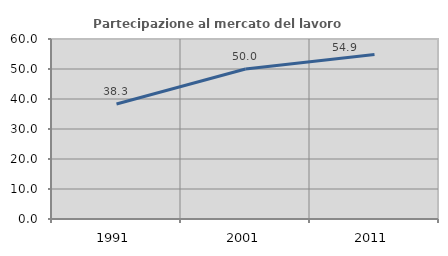
| Category | Partecipazione al mercato del lavoro  femminile |
|---|---|
| 1991.0 | 38.33 |
| 2001.0 | 50 |
| 2011.0 | 54.866 |